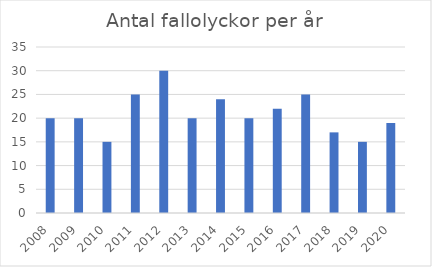
| Category | Antal fallolyckor |
|---|---|
| 2008.0 | 20 |
| 2009.0 | 20 |
| 2010.0 | 15 |
| 2011.0 | 25 |
| 2012.0 | 30 |
| 2013.0 | 20 |
| 2014.0 | 24 |
| 2015.0 | 20 |
| 2016.0 | 22 |
| 2017.0 | 25 |
| 2018.0 | 17 |
| 2019.0 | 15 |
| 2020.0 | 19 |